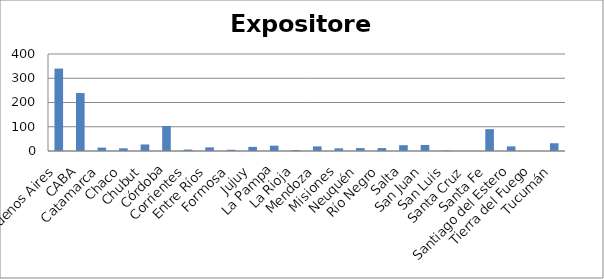
| Category | Series 0 |
|---|---|
| Buenos Aires | 340 |
| CABA | 239 |
| Catamarca | 14 |
| Chaco | 11 |
| Chubut | 27 |
| Córdoba | 103 |
| Corrientes | 6 |
| Entre Ríos | 15 |
| Formosa | 5 |
| Jujuy | 17 |
| La Pampa | 22 |
| La Rioja | 4 |
| Mendoza | 19 |
| Misiones | 11 |
| Neuquén | 12 |
| Río Negro | 12 |
| Salta | 24 |
| San Juan | 25 |
| San Luis | 2 |
| Santa Cruz | 0 |
| Santa Fe | 90 |
| Santiago del Estero | 19 |
| Tierra del Fuego | 0 |
| Tucumán | 32 |